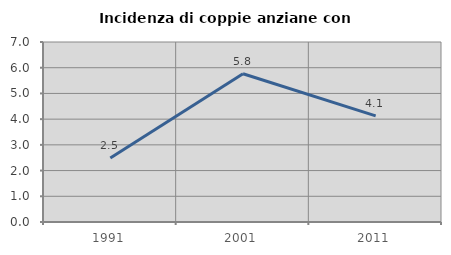
| Category | Incidenza di coppie anziane con figli |
|---|---|
| 1991.0 | 2.486 |
| 2001.0 | 5.764 |
| 2011.0 | 4.13 |